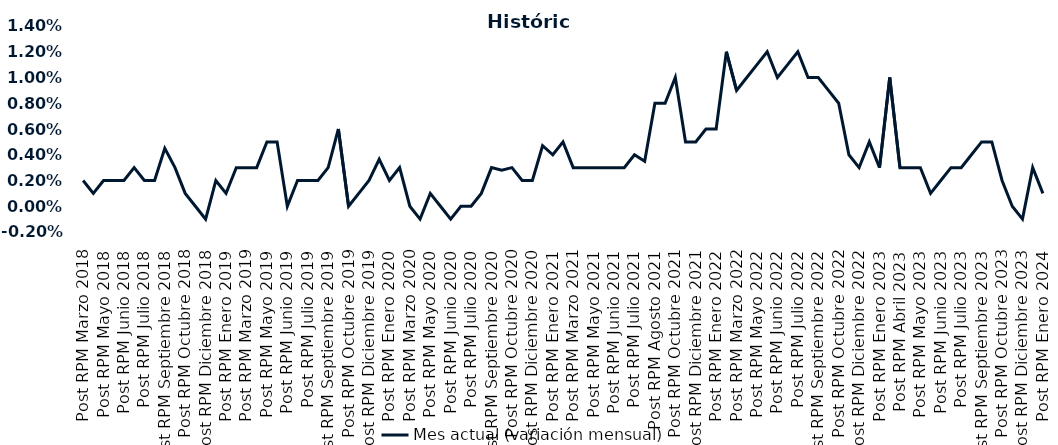
| Category | Mes actual (variación mensual)  |
|---|---|
| Post RPM Marzo 2018 | 0.002 |
| Pre RPM Mayo 2018 | 0.001 |
| Post RPM Mayo 2018 | 0.002 |
| Pre RPM Junio 2018 | 0.002 |
| Post RPM Junio 2018 | 0.002 |
| Pre RPM Julio 2018 | 0.003 |
| Post RPM Julio 2018 | 0.002 |
| Pre RPM Septiembre 2018 | 0.002 |
| Post RPM Septiembre 2018 | 0.004 |
| Pre RPM Octubre 2018 | 0.003 |
| Post RPM Octubre 2018 | 0.001 |
| Pre RPM Diciembre 2018 | 0 |
| Post RPM Diciembre 2018 | -0.001 |
| Pre RPM Enero 2019 | 0.002 |
| Post RPM Enero 2019 | 0.001 |
| Pre RPM Marzo 2019 | 0.003 |
| Post RPM Marzo 2019 | 0.003 |
| Pre RPM Mayo 2019 | 0.003 |
| Post RPM Mayo 2019 | 0.005 |
| Pre RPM Junio 2019 | 0.005 |
| Post RPM Junio 2019 | 0 |
| Pre RPM Julio 2019 | 0.002 |
| Post RPM Julio 2019 | 0.002 |
| Pre RPM Septiembre 2019 | 0.002 |
| Post RPM Septiembre 2019 | 0.003 |
| Pre RPM Octubre 2019 | 0.006 |
| Post RPM Octubre 2019 | 0 |
| Pre RPM Diciembre 2019 | 0.001 |
| Post RPM Diciembre 2019 | 0.002 |
| Pre RPM Enero 2020 | 0.004 |
| Post RPM Enero 2020 | 0.002 |
| Pre RPM Marzo 2020 | 0.003 |
| Post RPM Marzo 2020 | 0 |
| Pre RPM Mayo 2020 | -0.001 |
| Post RPM Mayo 2020 | 0.001 |
| Pre RPM Junio 2020 | 0 |
| Post RPM Junio 2020 | -0.001 |
| Pre RPM Julio 2020 | 0 |
| Post RPM Julio 2020 | 0 |
| Pre RPM Septiembre 2020 | 0.001 |
| Post RPM Septiembre 2020 | 0.003 |
| Pre RPM Octubre 2020 | 0.003 |
| Post RPM Octubre 2020 | 0.003 |
| Pre RPM Diciembre 2020 | 0.002 |
| Post RPM Diciembre 2020 | 0.002 |
| Pre RPM Enero 2021 | 0.005 |
| Post RPM Enero 2021 | 0.004 |
| Pre RPM Marzo 2021 | 0.005 |
| Post RPM Marzo 2021 | 0.003 |
| Pre RPM Mayo 2021 | 0.003 |
| Post RPM Mayo 2021 | 0.003 |
| Pre RPM Junio 2021 | 0.003 |
| Post RPM Junio 2021 | 0.003 |
| Pre RPM Julio 2021 | 0.003 |
| Post RPM Julio 2021 | 0.004 |
| Pre RPM Agosto 2021 | 0.004 |
| Post RPM Agosto 2021 | 0.008 |
| Pre RPM Octubre 2021 | 0.008 |
| Post RPM Octubre 2021 | 0.01 |
| Pre RPM Diciembre 2021 | 0.005 |
| Post RPM Diciembre 2021 | 0.005 |
| Pre RPM Enero 2022 | 0.006 |
| Post RPM Enero 2022 | 0.006 |
| Pre RPM Marzo 2022 | 0.012 |
| Post RPM Marzo 2022 | 0.009 |
| Pre RPM Mayo 2022 | 0.01 |
| Post RPM Mayo 2022 | 0.011 |
| Pre RPM Junio 2022 | 0.012 |
| Post RPM Junio 2022 | 0.01 |
| Pre RPM Julio 2022 | 0.011 |
| Post RPM Julio 2022 | 0.012 |
| Pre RPM Septiembre 2022 | 0.01 |
| Post RPM Septiembre 2022 | 0.01 |
| Pre RPM Octubre 2022 | 0.009 |
| Post RPM Octubre 2022 | 0.008 |
| Pre RPM Diciembre 2022 | 0.004 |
| Post RPM Diciembre 2022 | 0.003 |
| Pre RPM Enero 2023 | 0.005 |
| Post RPM Enero 2023 | 0.003 |
| Pre RPM Abril 2023 | 0.01 |
| Post RPM Abril 2023 | 0.003 |
| Pre RPM Mayo 2023 | 0.003 |
| Post RPM Mayo 2023 | 0.003 |
| Pre RPM Junio 2023 | 0.001 |
| Post RPM Junio 2023 | 0.002 |
| Pre RPM Julio 2023 | 0.003 |
| Post RPM Julio 2023 | 0.003 |
| Pre RPM Septiembre 2023 | 0.004 |
| Post RPM Septiembre 2023 | 0.005 |
| Pre RPM Octubre 2023 | 0.005 |
| Post RPM Octubre 2023 | 0.002 |
| Pre RPM Diciembre 2023 | 0 |
| Post RPM Diciembre 2023 | -0.001 |
| Pre RPM Enero 2024 | 0.003 |
| Post RPM Enero 2024 | 0.001 |